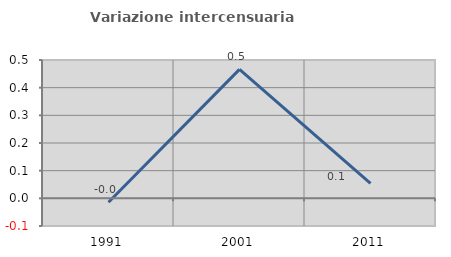
| Category | Variazione intercensuaria annua |
|---|---|
| 1991.0 | -0.014 |
| 2001.0 | 0.466 |
| 2011.0 | 0.054 |